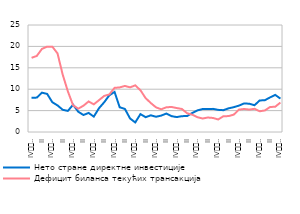
| Category | Нето стране директне инвестиције | Дефицит биланса текућих трансакција |
|---|---|---|
| IV
2007. | 8.007 | 17.335 |
| I | 8.035 | 17.769 |
| II | 9.188 | 19.419 |
| III | 8.903 | 19.947 |
| IV
2008. | 6.956 | 19.941 |
| I | 6.216 | 18.368 |
| II | 5.196 | 13.408 |
| III | 4.928 | 9.485 |
| IV
2009. | 6.365 | 6.254 |
| I | 4.743 | 5.448 |
| II | 3.966 | 6.144 |
| III | 4.456 | 7.133 |
| IV
2010. | 3.594 | 6.459 |
| I | 5.552 | 7.436 |
| II | 6.945 | 8.428 |
| III | 8.579 | 8.779 |
| IV
2011. | 9.364 | 10.313 |
| I | 5.774 | 10.421 |
| II | 5.392 | 10.762 |
| III | 3.153 | 10.432 |
| IV
2012. | 2.235 | 10.901 |
| I | 4.183 | 9.751 |
| II | 3.46 | 7.918 |
| III | 3.898 | 6.762 |
| IV
2013. | 3.564 | 5.761 |
| I | 3.83 | 5.308 |
| II | 4.313 | 5.776 |
| III | 3.703 | 5.85 |
| IV
2014. | 3.486 | 5.596 |
| I | 3.704 | 5.376 |
| II | 3.721 | 4.387 |
| III | 4.454 | 4.038 |
| IV
2015. | 5.05 | 3.454 |
| I | 5.369 | 3.149 |
| II | 5.378 | 3.384 |
| III | 5.404 | 3.279 |
| IV
2016. | 5.172 | 2.927 |
| I | 5.099 | 3.692 |
| II | 5.529 | 3.715 |
| III | 5.8 | 4.058 |
| IV
2017. | 6.166 | 5.23 |
| I | 6.674 | 5.381 |
| II | 6.605 | 5.239 |
| III | 6.254 | 5.42 |
| IV
2018. | 7.365 | 4.844 |
| I | 7.43 | 5.035 |
| II | 8.081 | 5.838 |
| III | 8.67 | 5.902 |
| IV
2019. | 7.804 | 6.882 |